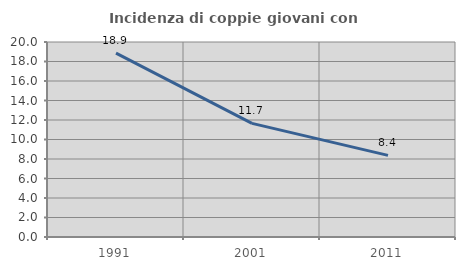
| Category | Incidenza di coppie giovani con figli |
|---|---|
| 1991.0 | 18.852 |
| 2001.0 | 11.652 |
| 2011.0 | 8.371 |